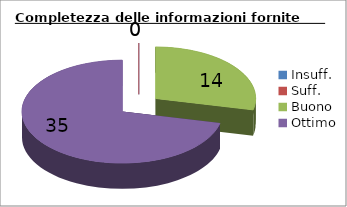
| Category | Completezza delle informazioni fornite |
|---|---|
| Insuff. | 0 |
| Suff. | 0 |
| Buono | 14 |
| Ottimo | 35 |